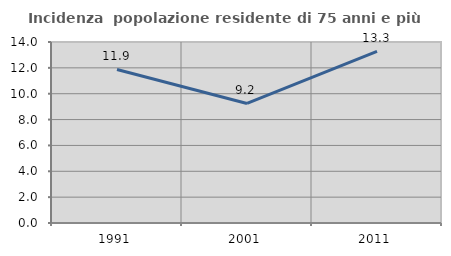
| Category | Incidenza  popolazione residente di 75 anni e più |
|---|---|
| 1991.0 | 11.873 |
| 2001.0 | 9.247 |
| 2011.0 | 13.28 |